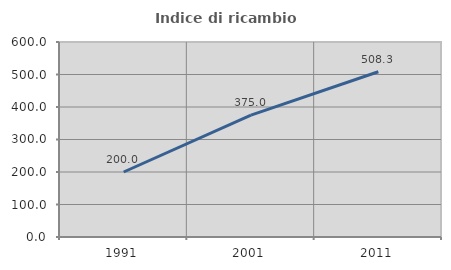
| Category | Indice di ricambio occupazionale  |
|---|---|
| 1991.0 | 200 |
| 2001.0 | 375 |
| 2011.0 | 508.333 |